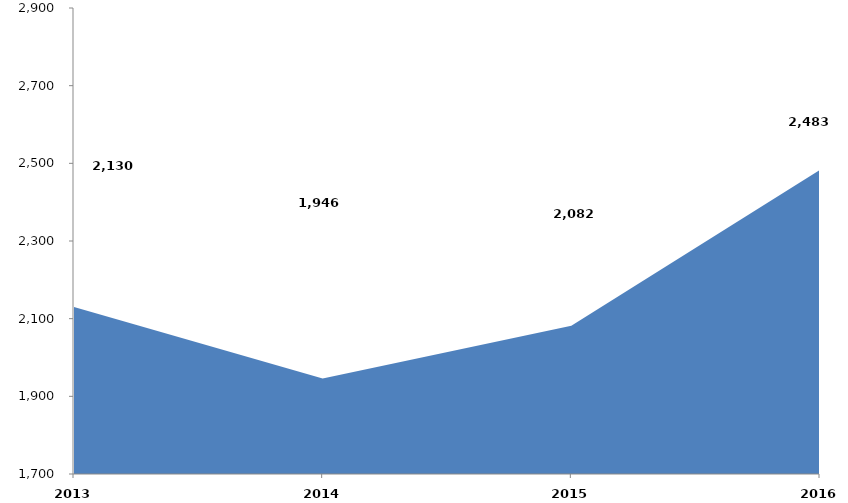
| Category | Series 0 |
|---|---|
| 2013 | 2129787.17 |
| 2014 | 1946092.31 |
| 2015 | 2081594 |
| 2016 | 2482839.641 |